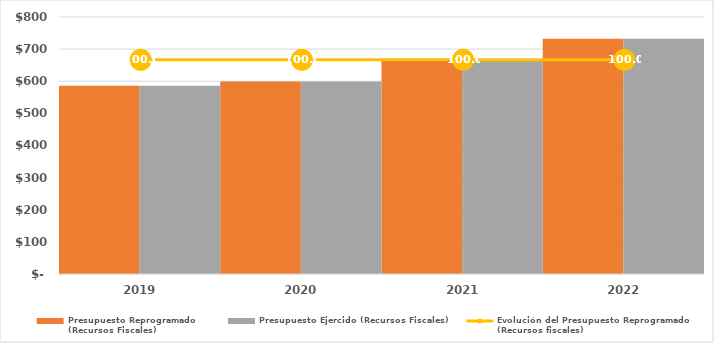
| Category | Presupuesto Reprogramado
(Recursos Fiscales) | Presupuesto Ejercido (Recursos Fiscales) |
|---|---|---|
| 2019.0 | 585973.956 | 585964.33 |
| 2020.0 | 599548.578 | 599548.578 |
| 2021.0 | 666637.126 | 666637.126 |
| 2022.0 | 732401.053 | 732401.053 |